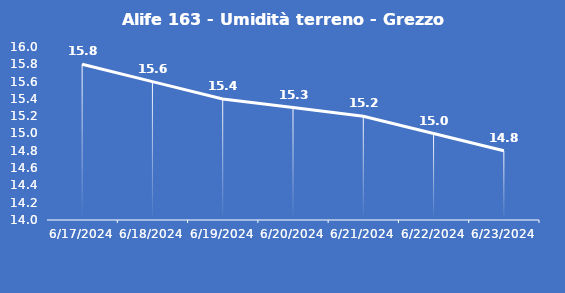
| Category | Alife 163 - Umidità terreno - Grezzo (%VWC) |
|---|---|
| 6/17/24 | 15.8 |
| 6/18/24 | 15.6 |
| 6/19/24 | 15.4 |
| 6/20/24 | 15.3 |
| 6/21/24 | 15.2 |
| 6/22/24 | 15 |
| 6/23/24 | 14.8 |